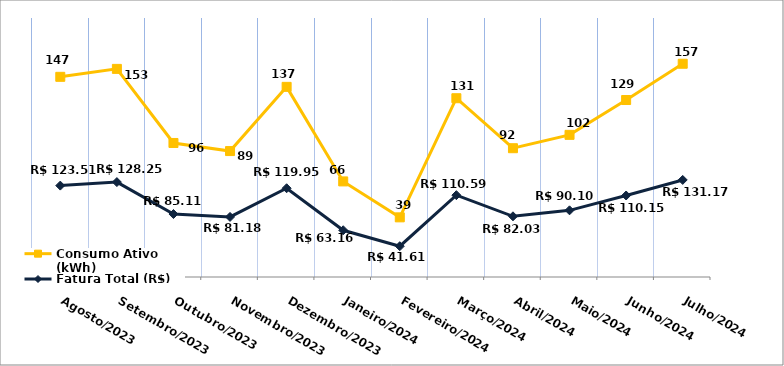
| Category | Fatura Total (R$) | Consumo Ativo (kWh) |
|---|---|---|
| Agosto/2023 | 123.51 | 147 |
| Setembro/2023 | 128.25 | 153 |
| Outubro/2023 | 85.11 | 96 |
| Novembro/2023 | 81.18 | 89 |
| Dezembro/2023 | 119.95 | 137 |
| Janeiro/2024 | 63.16 | 66 |
| Fevereiro/2024 | 41.61 | 39 |
| Março/2024 | 110.59 | 131 |
| Abril/2024 | 82.03 | 92 |
| Maio/2024 | 90.1 | 102 |
| Junho/2024 | 110.15 | 129 |
| Julho/2024 | 131.17 | 157 |